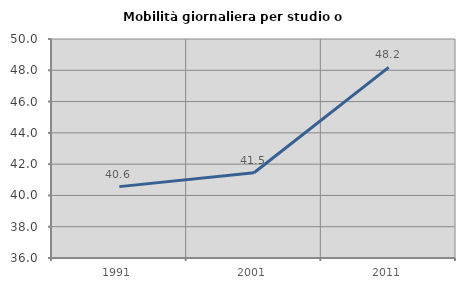
| Category | Mobilità giornaliera per studio o lavoro |
|---|---|
| 1991.0 | 40.563 |
| 2001.0 | 41.452 |
| 2011.0 | 48.185 |